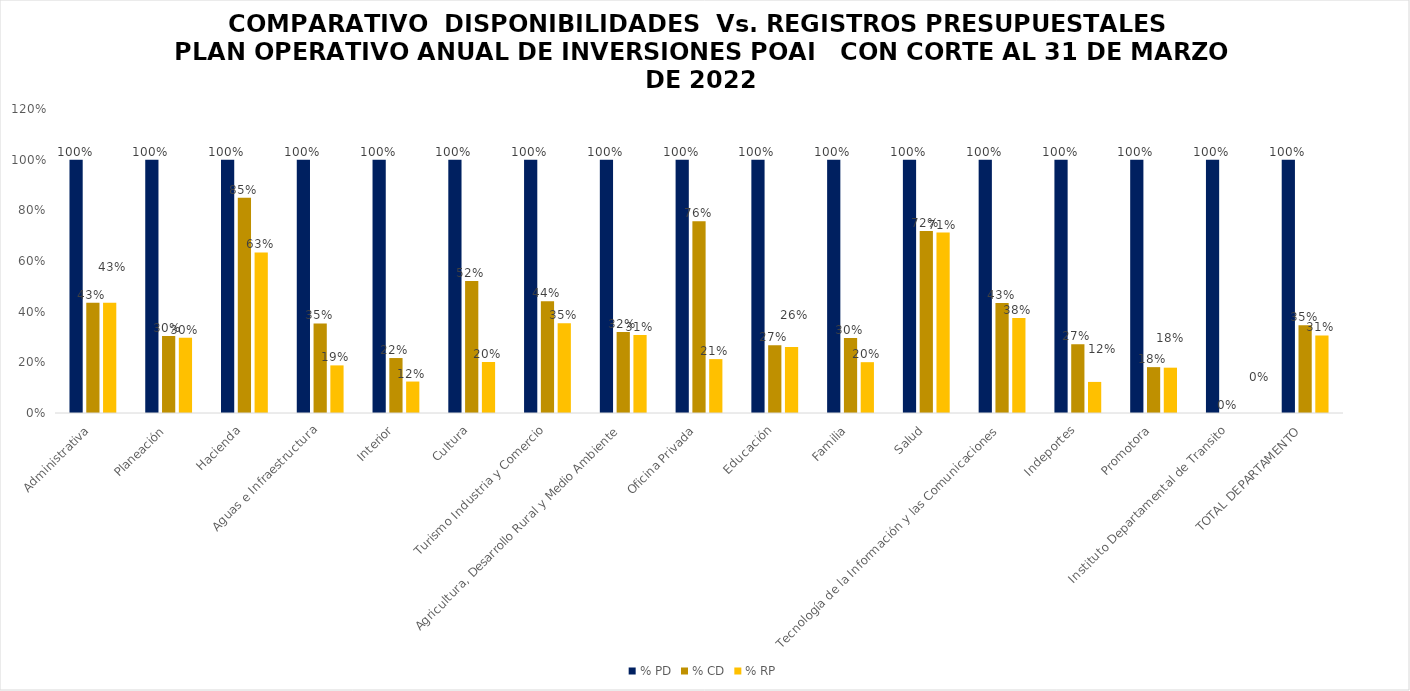
| Category | % PD | % CD | % RP |
|---|---|---|---|
| Administrativa | 1 | 0.435 | 0.435 |
| Planeación | 1 | 0.304 | 0.297 |
| Hacienda | 1 | 0.85 | 0.634 |
| Aguas e Infraestructura | 1 | 0.354 | 0.188 |
| Interior | 1 | 0.217 | 0.124 |
| Cultura | 1 | 0.521 | 0.201 |
| Turismo Industria y Comercio | 1 | 0.442 | 0.354 |
| Agricultura, Desarrollo Rural y Medio Ambiente | 1 | 0.32 | 0.308 |
| Oficina Privada | 1 | 0.756 | 0.213 |
| Educación | 1 | 0.267 | 0.26 |
| Familia | 1 | 0.296 | 0.201 |
| Salud | 1 | 0.718 | 0.712 |
| Tecnología de la Información y las Comunicaciones | 1 | 0.434 | 0.375 |
| Indeportes | 1 | 0.272 | 0.123 |
| Promotora | 1 | 0.181 | 0.179 |
| Instituto Departamental de Transito | 1 | 0 | 0 |
| TOTAL DEPARTAMENTO | 1 | 0.347 | 0.306 |